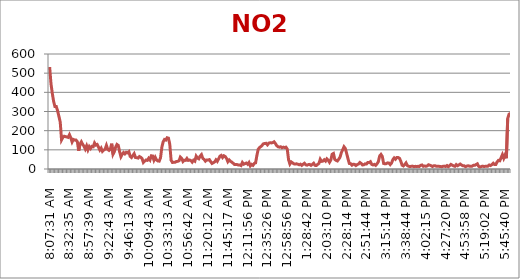
| Category | NO2 (index) |
|---|---|
| 0.3385532407407407 | 532 |
| 0.3396412037037037 | 445 |
| 0.3407291666666667 | 395 |
| 0.3418171296296297 | 353 |
| 0.34290509259259255 | 326 |
| 0.34399305555555554 | 326 |
| 0.3450810185185185 | 304 |
| 0.34616898148148145 | 275 |
| 0.34725694444444444 | 245 |
| 0.34943287037037035 | 152 |
| 0.35052083333333334 | 165 |
| 0.3516087962962963 | 171 |
| 0.3526967592592593 | 169 |
| 0.3537847222222222 | 167 |
| 0.35487268518518517 | 165 |
| 0.35596064814814815 | 179 |
| 0.3570486111111111 | 163 |
| 0.35813657407407407 | 141 |
| 0.35922453703703705 | 154 |
| 0.36031250000000004 | 151 |
| 0.36140046296296297 | 151 |
| 0.36248842592592595 | 142 |
| 0.3646643518518518 | 95 |
| 0.3657523148148148 | 130 |
| 0.3668402777777778 | 142 |
| 0.3679282407407407 | 129 |
| 0.3690162037037037 | 119 |
| 0.3701041666666667 | 104 |
| 0.37119212962962966 | 121 |
| 0.3722800925925926 | 100 |
| 0.3733680555555556 | 117 |
| 0.37445601851851856 | 107 |
| 0.37554398148148144 | 118 |
| 0.3766319444444444 | 116 |
| 0.3777199074074074 | 136 |
| 0.37880787037037034 | 125 |
| 0.3798958333333333 | 128 |
| 0.3809837962962963 | 114 |
| 0.3820717592592593 | 99 |
| 0.3831597222222222 | 109 |
| 0.3842476851851852 | 92 |
| 0.3853356481481482 | 99 |
| 0.38642361111111106 | 103 |
| 0.38751157407407405 | 123 |
| 0.38968749999999996 | 102 |
| 0.39077546296296295 | 97 |
| 0.39186342592592593 | 104 |
| 0.3929513888888889 | 132 |
| 0.39403935185185185 | 77 |
| 0.39512731481481483 | 90 |
| 0.3962152777777778 | 114 |
| 0.3973032407407407 | 128 |
| 0.3983912037037037 | 123 |
| 0.39947916666666666 | 90 |
| 0.40056712962962965 | 64 |
| 0.4016550925925926 | 77 |
| 0.40274305555555556 | 86 |
| 0.40383101851851855 | 79 |
| 0.4049189814814815 | 87 |
| 0.40600694444444446 | 84 |
| 0.40709490740740745 | 90 |
| 0.4081828703703703 | 66 |
| 0.4092708333333333 | 60 |
| 0.4103587962962963 | 70 |
| 0.4114467592592593 | 80 |
| 0.4125347222222222 | 60 |
| 0.4136226851851852 | 59 |
| 0.4147106481481482 | 57 |
| 0.4157986111111111 | 65 |
| 0.4168865740740741 | 61 |
| 0.4179745370370371 | 54 |
| 0.41906249999999995 | 34 |
| 0.42015046296296293 | 41 |
| 0.4212384259259259 | 47 |
| 0.4223263888888889 | 45 |
| 0.42341435185185183 | 56 |
| 0.4245023148148148 | 47 |
| 0.4255902777777778 | 69 |
| 0.42667824074074073 | 68 |
| 0.4277662037037037 | 46 |
| 0.4288541666666667 | 61 |
| 0.4299421296296296 | 47 |
| 0.43103009259259256 | 42 |
| 0.43211805555555555 | 41 |
| 0.43320601851851853 | 59 |
| 0.43429398148148146 | 114 |
| 0.43538194444444445 | 142 |
| 0.43646990740740743 | 154 |
| 0.43755787037037036 | 151 |
| 0.43864583333333335 | 163 |
| 0.43973379629629633 | 161 |
| 0.4408217592592592 | 129 |
| 0.4419097222222222 | 46 |
| 0.4429976851851852 | 34 |
| 0.44408564814814816 | 35 |
| 0.4451736111111111 | 35 |
| 0.4462615740740741 | 39 |
| 0.44734953703703706 | 40 |
| 0.4484375 | 43 |
| 0.449525462962963 | 62 |
| 0.4506018518518518 | 55 |
| 0.4516898148148148 | 39 |
| 0.4527777777777778 | 46 |
| 0.4538657407407407 | 45 |
| 0.4549537037037037 | 55 |
| 0.4560416666666667 | 45 |
| 0.45712962962962966 | 47 |
| 0.4582175925925926 | 44 |
| 0.4593055555555556 | 36 |
| 0.46039351851851856 | 46 |
| 0.46148148148148144 | 41 |
| 0.4625694444444444 | 67 |
| 0.4636574074074074 | 57 |
| 0.46474537037037034 | 53 |
| 0.4658333333333333 | 67 |
| 0.4669212962962963 | 75 |
| 0.4680092592592593 | 56 |
| 0.4690972222222222 | 50 |
| 0.4701851851851852 | 41 |
| 0.4712731481481482 | 47 |
| 0.47236111111111106 | 47 |
| 0.47344907407407405 | 49 |
| 0.47453703703703703 | 38 |
| 0.47562499999999996 | 29 |
| 0.47671296296296295 | 33 |
| 0.47780092592592593 | 37 |
| 0.4788888888888889 | 48 |
| 0.47997685185185185 | 40 |
| 0.4821527777777778 | 53 |
| 0.4832407407407407 | 67 |
| 0.4843287037037037 | 71 |
| 0.48541666666666666 | 60 |
| 0.4865162037037037 | 69 |
| 0.48760416666666667 | 65 |
| 0.4886921296296296 | 55 |
| 0.4897800925925926 | 38 |
| 0.49086805555555557 | 47 |
| 0.4919560185185185 | 40 |
| 0.4930439814814815 | 36 |
| 0.49413194444444447 | 30 |
| 0.4952314814814815 | 24 |
| 0.4963194444444445 | 24 |
| 0.49740740740740735 | 23 |
| 0.49849537037037034 | 21 |
| 0.4995833333333333 | 21 |
| 0.5006712962962964 | 18 |
| 0.5039351851851852 | 34 |
| 0.5050231481481481 | 25 |
| 0.5061111111111111 | 28 |
| 0.507199074074074 | 31 |
| 0.508287037037037 | 25 |
| 0.509375 | 34 |
| 0.510462962962963 | 16 |
| 0.511550925925926 | 24 |
| 0.5126388888888889 | 19 |
| 0.5137268518518519 | 29 |
| 0.5148148148148148 | 32 |
| 0.5159027777777777 | 71 |
| 0.5169907407407407 | 103 |
| 0.5180787037037037 | 112 |
| 0.5191666666666667 | 117 |
| 0.5202546296296297 | 124 |
| 0.5213425925925926 | 132 |
| 0.5224305555555556 | 133 |
| 0.5235185185185185 | 134 |
| 0.5246064814814815 | 126 |
| 0.5256944444444445 | 135 |
| 0.5267824074074073 | 137 |
| 0.5278703703703703 | 136 |
| 0.5289583333333333 | 138 |
| 0.5300462962962963 | 142 |
| 0.5311342592592593 | 133 |
| 0.5322222222222223 | 122 |
| 0.5333101851851852 | 116 |
| 0.5343981481481481 | 114 |
| 0.5354861111111111 | 116 |
| 0.5365740740740741 | 111 |
| 0.537662037037037 | 114 |
| 0.53875 | 112 |
| 0.5398379629629629 | 114 |
| 0.5409259259259259 | 104 |
| 0.5420138888888889 | 48 |
| 0.5431018518518519 | 26 |
| 0.5441898148148149 | 37 |
| 0.5452777777777778 | 32 |
| 0.5463657407407407 | 27 |
| 0.5474537037037037 | 26 |
| 0.5485416666666666 | 27 |
| 0.5496296296296296 | 25 |
| 0.5507175925925926 | 22 |
| 0.5518055555555555 | 25 |
| 0.5528935185185185 | 19 |
| 0.5539814814814815 | 25 |
| 0.5572453703703704 | 30 |
| 0.5605092592592592 | 22 |
| 0.5615972222222222 | 20 |
| 0.5626851851851852 | 23 |
| 0.5659490740740741 | 24 |
| 0.567037037037037 | 19 |
| 0.568125 | 24 |
| 0.569212962962963 | 30 |
| 0.570300925925926 | 19 |
| 0.5724768518518518 | 18 |
| 0.5735648148148148 | 24 |
| 0.5790046296296296 | 29 |
| 0.5800925925925926 | 51 |
| 0.5811805555555556 | 40 |
| 0.5822685185185185 | 41 |
| 0.5833564814814814 | 48 |
| 0.5844444444444444 | 41 |
| 0.5855324074074074 | 53 |
| 0.5866203703703704 | 46 |
| 0.5877083333333334 | 35 |
| 0.5887962962962963 | 47 |
| 0.5898842592592592 | 77 |
| 0.5909722222222222 | 81 |
| 0.5931481481481481 | 50 |
| 0.5942361111111111 | 45 |
| 0.5953240740740741 | 42 |
| 0.596412037037037 | 51 |
| 0.5975 | 62 |
| 0.598587962962963 | 86 |
| 0.599675925925926 | 100 |
| 0.6007638888888889 | 116 |
| 0.6018518518518519 | 107 |
| 0.6029398148148148 | 81 |
| 0.6040277777777777 | 54 |
| 0.6051157407407407 | 29 |
| 0.6062037037037037 | 28 |
| 0.6072916666666667 | 20 |
| 0.6083796296296297 | 25 |
| 0.6094675925925926 | 24 |
| 0.6105555555555556 | 18 |
| 0.6116435185185185 | 23 |
| 0.6127314814814815 | 26 |
| 0.6138194444444445 | 34 |
| 0.6149074074074073 | 29 |
| 0.6159953703703703 | 21 |
| 0.6170833333333333 | 22 |
| 0.6181712962962963 | 27 |
| 0.6192592592592593 | 26 |
| 0.6203472222222223 | 34 |
| 0.6214351851851853 | 33 |
| 0.6225231481481481 | 38 |
| 0.6236111111111111 | 24 |
| 0.6246990740740741 | 21 |
| 0.625787037037037 | 24 |
| 0.626875 | 19 |
| 0.627962962962963 | 27 |
| 0.6290509259259259 | 38 |
| 0.6301388888888889 | 68 |
| 0.6312268518518519 | 76 |
| 0.6323148148148149 | 66 |
| 0.6334027777777778 | 29 |
| 0.6344907407407407 | 27 |
| 0.6355787037037037 | 28 |
| 0.6366666666666666 | 32 |
| 0.6377546296296296 | 31 |
| 0.6388425925925926 | 23 |
| 0.6399305555555556 | 31 |
| 0.6410185185185185 | 49 |
| 0.6421064814814815 | 58 |
| 0.6431944444444445 | 51 |
| 0.6442824074074074 | 60 |
| 0.6453703703703704 | 60 |
| 0.6464583333333334 | 56 |
| 0.6475462962962962 | 41 |
| 0.6486342592592592 | 20 |
| 0.6497222222222222 | 16 |
| 0.6508101851851852 | 23 |
| 0.6518981481481482 | 32 |
| 0.6529861111111112 | 18 |
| 0.6540740740740741 | 14 |
| 0.655162037037037 | 13 |
| 0.65625 | 14 |
| 0.657337962962963 | 15 |
| 0.6584259259259259 | 12 |
| 0.6595138888888888 | 14 |
| 0.6606018518518518 | 13 |
| 0.6616898148148148 | 14 |
| 0.6627777777777778 | 13 |
| 0.6638657407407408 | 19 |
| 0.6649537037037038 | 21 |
| 0.6660416666666666 | 14 |
| 0.6671296296296297 | 16 |
| 0.6682291666666668 | 14 |
| 0.6693171296296296 | 16 |
| 0.6704050925925925 | 22 |
| 0.6714930555555556 | 20 |
| 0.6725810185185185 | 17 |
| 0.6736805555555555 | 13 |
| 0.6747685185185185 | 17 |
| 0.6769444444444445 | 17 |
| 0.6780324074074073 | 14 |
| 0.6791203703703704 | 14 |
| 0.6802083333333333 | 14 |
| 0.6812962962962964 | 13 |
| 0.6823842592592593 | 12 |
| 0.6834722222222221 | 14 |
| 0.6845601851851852 | 15 |
| 0.6856481481481481 | 13 |
| 0.6878240740740741 | 18 |
| 0.6889120370370371 | 12 |
| 0.69 | 17 |
| 0.691087962962963 | 24 |
| 0.6921759259259259 | 20 |
| 0.6943518518518519 | 16 |
| 0.6954398148148148 | 14 |
| 0.6965277777777777 | 23 |
| 0.6976157407407407 | 17 |
| 0.6987037037037037 | 21 |
| 0.6997916666666667 | 26 |
| 0.7008796296296297 | 21 |
| 0.7019675925925926 | 17 |
| 0.7030555555555557 | 17 |
| 0.7041435185185185 | 12 |
| 0.7052314814814814 | 15 |
| 0.7074074074074074 | 17 |
| 0.7084953703703704 | 15 |
| 0.7095833333333333 | 15 |
| 0.7106712962962963 | 15 |
| 0.7117592592592592 | 19 |
| 0.7128472222222223 | 19 |
| 0.7139351851851852 | 23 |
| 0.715023148148148 | 27 |
| 0.7161111111111111 | 14 |
| 0.717199074074074 | 10 |
| 0.718287037037037 | 13 |
| 0.719375 | 15 |
| 0.720462962962963 | 13 |
| 0.721550925925926 | 14 |
| 0.7226388888888889 | 15 |
| 0.7237268518518518 | 15 |
| 0.7269907407407407 | 21 |
| 0.7280787037037038 | 18 |
| 0.7291666666666666 | 23 |
| 0.7302546296296296 | 30 |
| 0.7313425925925926 | 23 |
| 0.7324305555555556 | 23 |
| 0.7335185185185185 | 37 |
| 0.7346064814814816 | 45 |
| 0.7356944444444444 | 43 |
| 0.7367824074074073 | 59 |
| 0.7378703703703704 | 75 |
| 0.7389583333333333 | 56 |
| 0.7400462962962964 | 73 |
| 0.7411342592592592 | 56 |
| 0.7422222222222222 | 263 |
| 0.7433101851851852 | 286 |
| 0.7443981481481482 | 290 |